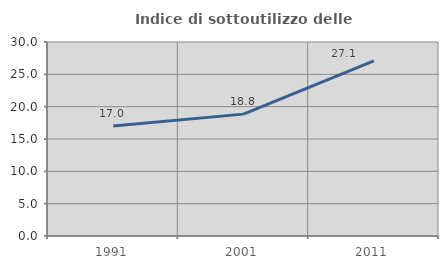
| Category | Indice di sottoutilizzo delle abitazioni  |
|---|---|
| 1991.0 | 17.009 |
| 2001.0 | 18.846 |
| 2011.0 | 27.082 |